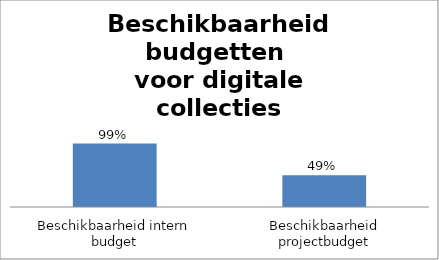
| Category | Series 0 |
|---|---|
| Beschikbaarheid intern budget | 0.988 |
| Beschikbaarheid projectbudget | 0.494 |